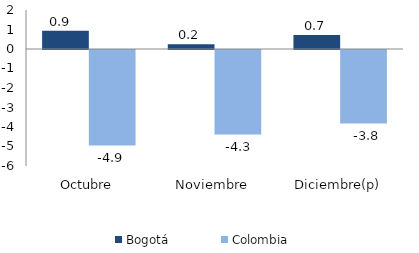
| Category | Bogotá | Colombia |
|---|---|---|
| Octubre | 0.938 | -4.897 |
| Noviembre | 0.237 | -4.331 |
| Diciembre(p) | 0.717 | -3.767 |